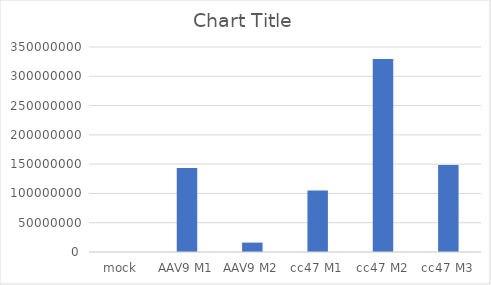
| Category | Series 0 |
|---|---|
| mock | 363.271 |
| AAV9 M1 | 143449463.493 |
| AAV9 M2 | 16009694.827 |
| cc47 M1 | 105042922.827 |
| cc47 M2 | 329532992.493 |
| cc47 M3 | 148550663.16 |